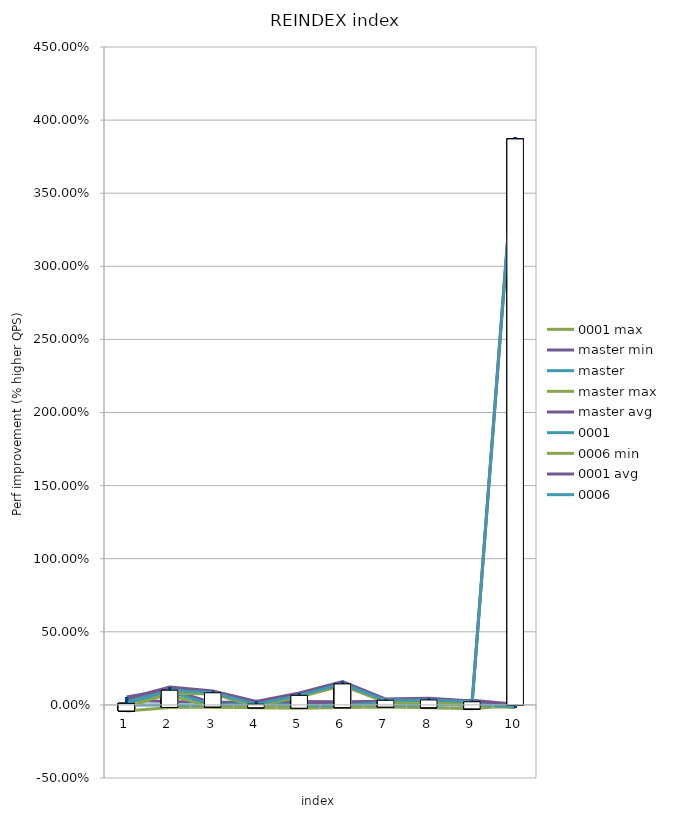
| Category | max | master min | master | avg | 0001 | 0006 min | 0006 |
|---|---|---|---|---|---|---|---|
| 0 | 0.015 | 0.032 | 0 | 0.043 | 0.031 | -0.017 | 0.01 |
| 1 | 0.068 | 0.023 | 0 | 0.122 | 0.091 | 0.08 | 0.1 |
| 2 | -0.017 | 0.021 | 0 | 0.096 | 0 | 0.075 | 0.083 |
| 3 | -0.016 | 0.015 | 0 | 0.023 | 0.008 | -0.008 | 0.005 |
| 4 | -0.016 | 0.023 | 0 | 0.081 | -0.003 | 0.053 | 0.065 |
| 5 | -0.01 | 0.022 | 0 | 0.16 | -0.005 | 0.132 | 0.144 |
| 6 | 0.008 | 0.025 | 0 | 0.04 | 0.017 | 0.017 | 0.031 |
| 7 | 0.018 | 0.017 | 0 | 0.045 | 0.024 | 0.015 | 0.034 |
| 8 | -0.008 | 0.032 | 0 | 0.027 | 0.004 | 0.017 | 0.022 |
| 9 | -0.017 | 0.004 | 0 | 3.884 | -0.012 | 3.849 | 3.871 |